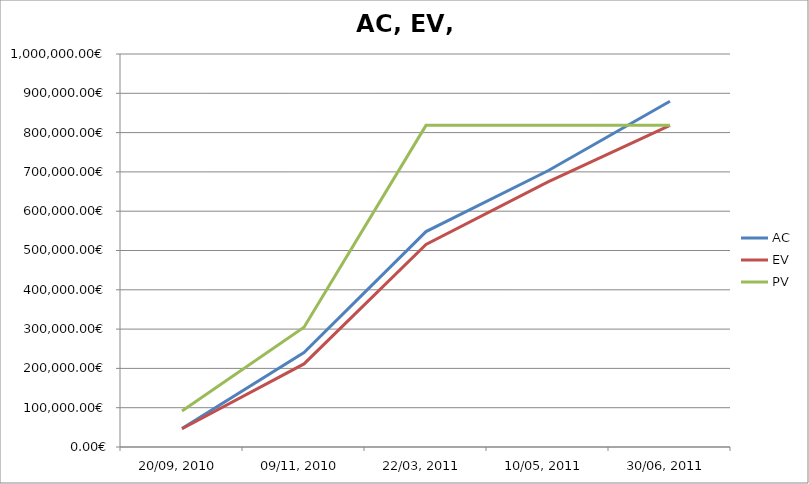
| Category | AC | EV | PV |
|---|---|---|---|
| 20/09, 2010 | 46883.88 | 46563.23 | 91379.109 |
| 09/11, 2010 | 240403.501 | 211368.581 | 304535.342 |
| 22/03, 2011 | 548153.898 | 515200.957 | 818439.992 |
| 10/05, 2011 | 702797.594 | 674567.494 | 818439.992 |
| 30/06, 2011 | 879853.171 | 818439.992 | 818439.992 |